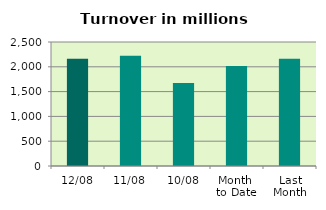
| Category | Series 0 |
|---|---|
| 12/08 | 2160.718 |
| 11/08 | 2221.018 |
| 10/08 | 1674.99 |
| Month 
to Date | 2016.526 |
| Last
Month | 2162.227 |